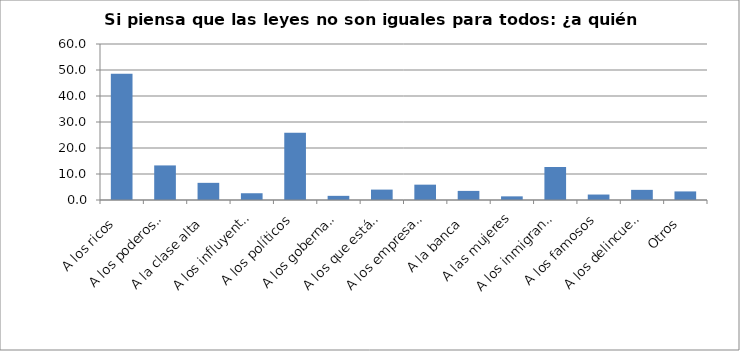
| Category | % |
|---|---|
| A los ricos  | 48.6 |
| A los poderosos  | 13.3 |
| A la clase alta  | 6.6 |
| A los influyentes | 2.6 |
| A los políticos  | 25.9 |
| A los gobernantes  | 1.6 |
| A los que están cerca del poder | 4 |
| A los empresarios | 5.9 |
| A la banca  | 3.5 |
| A las mujeres | 1.4 |
| A los inmigrantes | 12.7 |
| A los famosos  | 2.1 |
| A los delincuentes | 3.9 |
| Otros  | 3.3 |